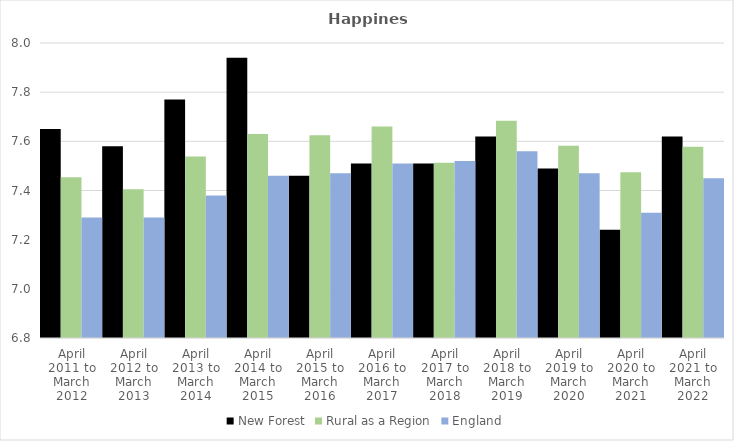
| Category | New Forest | Rural as a Region | England |
|---|---|---|---|
| April 2011 to March 2012 | 7.65 | 7.454 | 7.29 |
| April 2012 to March 2013 | 7.58 | 7.406 | 7.29 |
| April 2013 to March 2014 | 7.77 | 7.539 | 7.38 |
| April 2014 to March 2015 | 7.94 | 7.63 | 7.46 |
| April 2015 to March 2016 | 7.46 | 7.625 | 7.47 |
| April 2016 to March 2017 | 7.51 | 7.661 | 7.51 |
| April 2017 to March 2018 | 7.51 | 7.513 | 7.52 |
| April 2018 to March 2019 | 7.62 | 7.684 | 7.56 |
| April 2019 to March 2020 | 7.49 | 7.582 | 7.47 |
| April 2020 to March 2021 | 7.24 | 7.474 | 7.31 |
| April 2021 to March 2022 | 7.62 | 7.577 | 7.45 |